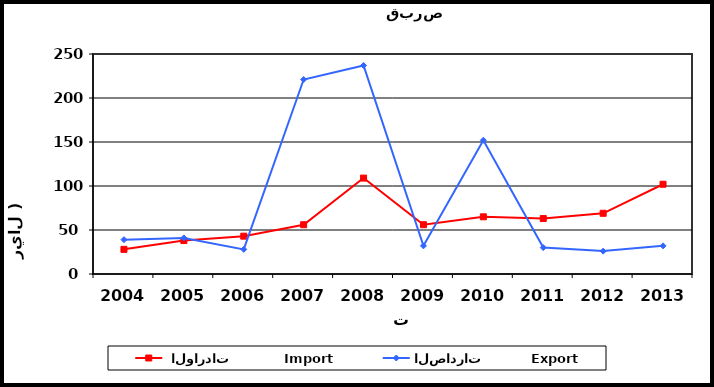
| Category |  الواردات           Import | الصادرات          Export |
|---|---|---|
| 2004.0 | 28 | 39 |
| 2005.0 | 38 | 41 |
| 2006.0 | 43 | 28 |
| 2007.0 | 56 | 221 |
| 2008.0 | 109 | 237 |
| 2009.0 | 56 | 32 |
| 2010.0 | 65 | 152 |
| 2011.0 | 63 | 30 |
| 2012.0 | 69 | 26 |
| 2013.0 | 102 | 32 |